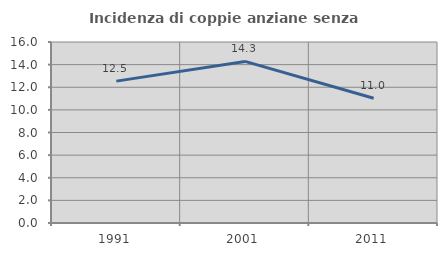
| Category | Incidenza di coppie anziane senza figli  |
|---|---|
| 1991.0 | 12.541 |
| 2001.0 | 14.286 |
| 2011.0 | 11.027 |